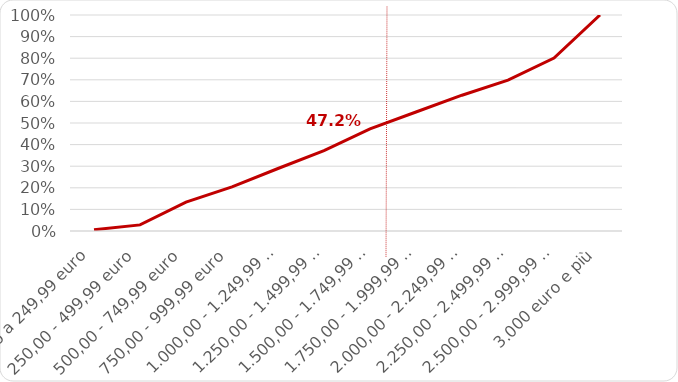
| Category | Series 0 |
|---|---|
| fino a 249,99 euro | 0.006 |
| 250,00 - 499,99 euro | 0.028 |
| 500,00 - 749,99 euro | 0.134 |
| 750,00 - 999,99 euro | 0.204 |
| 1.000,00 - 1.249,99 euro | 0.289 |
| 1.250,00 - 1.499,99 euro | 0.373 |
| 1.500,00 - 1.749,99 euro | 0.472 |
| 1.750,00 - 1.999,99 euro | 0.551 |
| 2.000,00 - 2.249,99 euro | 0.629 |
| 2.250,00 - 2.499,99 euro | 0.698 |
| 2.500,00 - 2.999,99 euro | 0.801 |
| 3.000 euro e più | 1 |